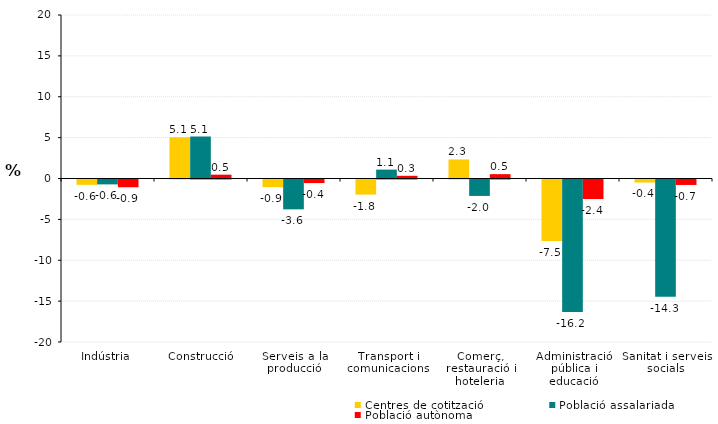
| Category | Centres de cotització | Població assalariada | Població autònoma |
|---|---|---|---|
| Indústria | -0.65 | -0.598 | -0.947 |
| Construcció | 5.055 | 5.136 | 0.47 |
| Serveis a la producció | -0.927 | -3.65 | -0.436 |
| Transport i comunicacions | -1.844 | 1.089 | 0.329 |
| Comerç, restauració i hoteleria | 2.329 | -2.009 | 0.531 |
| Administració pública i educació | -7.517 | -16.213 | -2.391 |
| Sanitat i serveis socials | -0.366 | -14.342 | -0.668 |